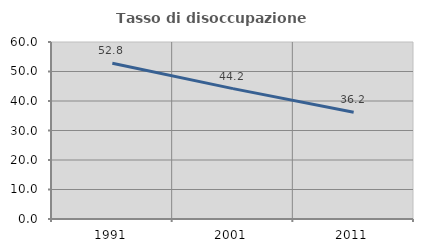
| Category | Tasso di disoccupazione giovanile  |
|---|---|
| 1991.0 | 52.766 |
| 2001.0 | 44.203 |
| 2011.0 | 36.17 |